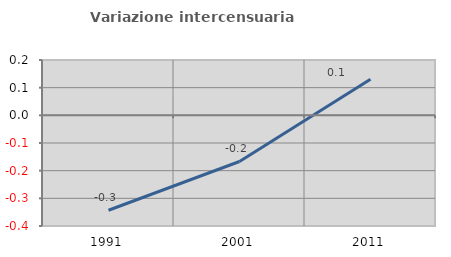
| Category | Variazione intercensuaria annua |
|---|---|
| 1991.0 | -0.343 |
| 2001.0 | -0.167 |
| 2011.0 | 0.13 |